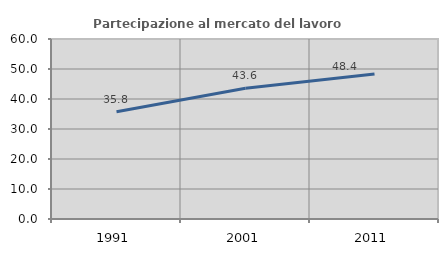
| Category | Partecipazione al mercato del lavoro  femminile |
|---|---|
| 1991.0 | 35.753 |
| 2001.0 | 43.59 |
| 2011.0 | 48.359 |